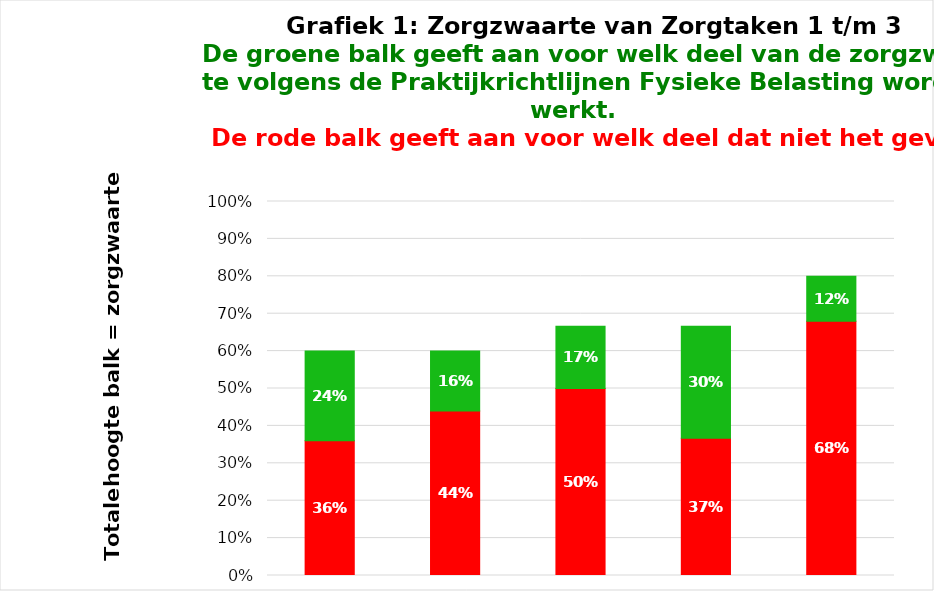
| Category | Series 0 | Series 1 |
|---|---|---|
| 0 | 0.36 | 0.24 |
| 1 | 0.44 | 0.16 |
| 2 | 0.5 | 0.167 |
| 3 | 0.367 | 0.3 |
| 4 | 0.68 | 0.12 |